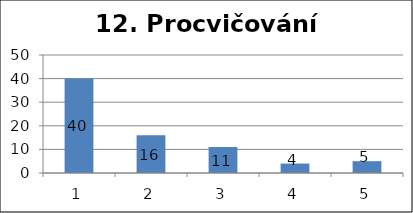
| Category | Series 1 |
|---|---|
| 0 | 40 |
| 1 | 16 |
| 2 | 11 |
| 3 | 4 |
| 4 | 5 |